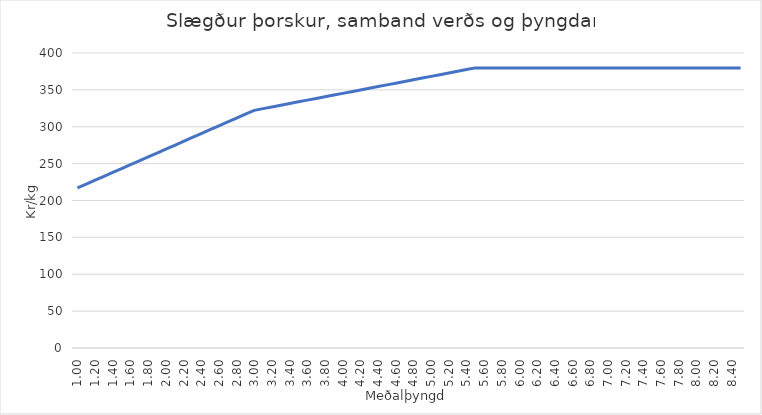
| Category | Series 0 |
|---|---|
| 1.0 | 217.03 |
| 1.1 | 222.291 |
| 1.2 | 227.552 |
| 1.3 | 232.814 |
| 1.4 | 238.075 |
| 1.5 | 243.336 |
| 1.6 | 248.598 |
| 1.7 | 253.859 |
| 1.8 | 259.12 |
| 1.9 | 264.382 |
| 2.0 | 269.643 |
| 2.1 | 274.904 |
| 2.2 | 280.166 |
| 2.3 | 285.427 |
| 2.4 | 290.688 |
| 2.5 | 295.95 |
| 2.6 | 301.211 |
| 2.7 | 306.472 |
| 2.8 | 311.734 |
| 2.9 | 316.995 |
| 3.0 | 322.256 |
| 3.1 | 324.558 |
| 3.2 | 326.86 |
| 3.3 | 329.162 |
| 3.4 | 331.464 |
| 3.5 | 333.766 |
| 3.6 | 336.068 |
| 3.7 | 338.37 |
| 3.8 | 340.671 |
| 3.9 | 342.973 |
| 4.0 | 345.275 |
| 4.1 | 347.577 |
| 4.2 | 349.879 |
| 4.3 | 352.181 |
| 4.4 | 354.483 |
| 4.5 | 356.785 |
| 4.6 | 359.087 |
| 4.7 | 361.389 |
| 4.8 | 363.691 |
| 4.9 | 365.993 |
| 5.0 | 368.294 |
| 5.1 | 370.596 |
| 5.2 | 372.898 |
| 5.3 | 375.2 |
| 5.4 | 377.502 |
| 5.5 | 379.804 |
| 5.6 | 379.804 |
| 5.7 | 379.804 |
| 5.8 | 379.804 |
| 5.9 | 379.804 |
| 6.0 | 379.804 |
| 6.1 | 379.804 |
| 6.2 | 379.804 |
| 6.3 | 379.804 |
| 6.4 | 379.804 |
| 6.50000000000001 | 379.804 |
| 6.6 | 379.804 |
| 6.7 | 379.804 |
| 6.80000000000001 | 379.804 |
| 6.90000000000001 | 379.804 |
| 7.00000000000001 | 379.804 |
| 7.100000000000009 | 379.804 |
| 7.200000000000009 | 379.804 |
| 7.300000000000009 | 379.804 |
| 7.400000000000008 | 379.804 |
| 7.500000000000008 | 379.804 |
| 7.600000000000008 | 379.804 |
| 7.700000000000007 | 379.804 |
| 7.800000000000007 | 379.804 |
| 7.900000000000007 | 379.804 |
| 8.000000000000007 | 379.804 |
| 8.100000000000007 | 379.804 |
| 8.200000000000006 | 379.804 |
| 8.300000000000006 | 379.804 |
| 8.400000000000006 | 379.804 |
| 8.500000000000005 | 379.804 |